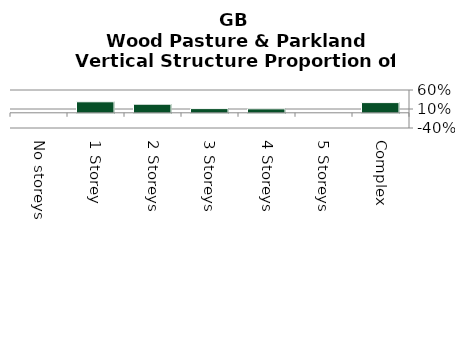
| Category | Wood Pasture & Parkland |
|---|---|
| No storeys | 0 |
| 1 Storey | 0.29 |
| 2 Storeys | 0.227 |
| 3 Storeys | 0.11 |
| 4 Storeys | 0.104 |
| 5 Storeys | 0 |
| Complex | 0.269 |